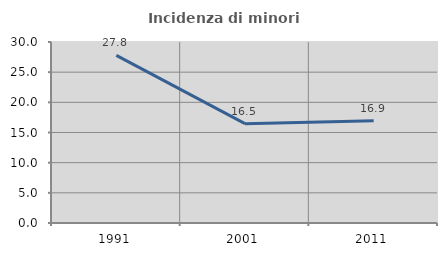
| Category | Incidenza di minori stranieri |
|---|---|
| 1991.0 | 27.778 |
| 2001.0 | 16.471 |
| 2011.0 | 16.942 |